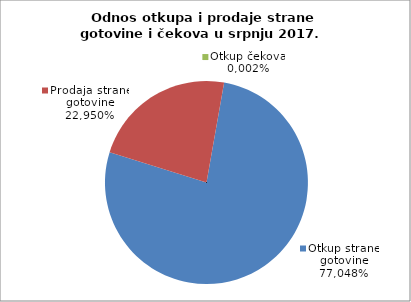
| Category | Otkup strane gotovine |
|---|---|
| 0 | 0.77 |
| 1 | 0.23 |
| 2 | 0 |